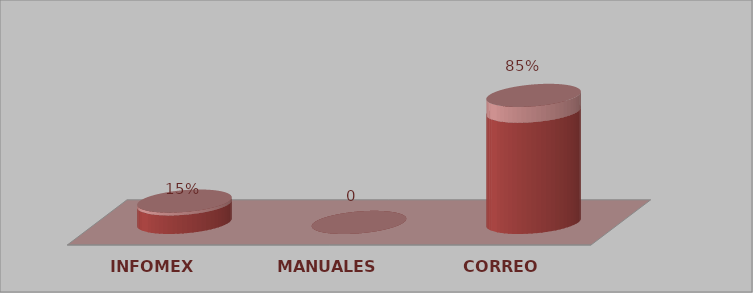
| Category | Series 0 | Series 1 |
|---|---|---|
| INFOMEX | 1 | 0.15 |
| MANUALES | 0 | 0 |
| CORREO | 6 | 0.85 |